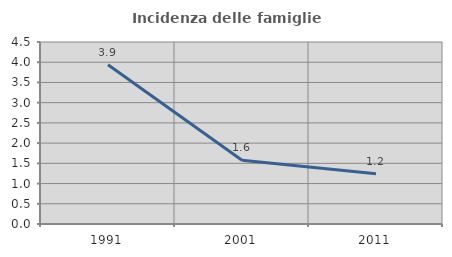
| Category | Incidenza delle famiglie numerose |
|---|---|
| 1991.0 | 3.937 |
| 2001.0 | 1.574 |
| 2011.0 | 1.241 |